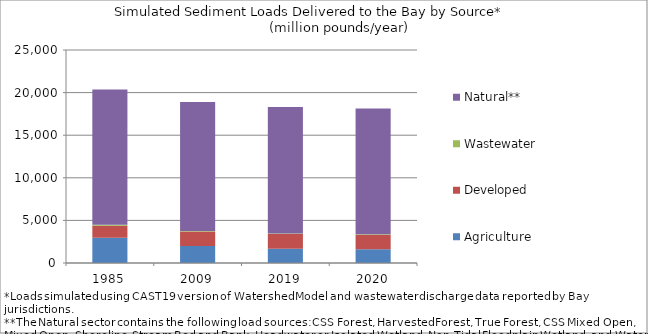
| Category | Agriculture | Developed | Wastewater | Natural** |
|---|---|---|---|---|
| 1985.0 | 2977.836 | 1382.732 | 125.811 | 15879.557 |
| 2009.0 | 2007.27 | 1683.184 | 60.487 | 15159.816 |
| 2019.0 | 1681.206 | 1724.709 | 47.653 | 14856.198 |
| 2020.0 | 1627.226 | 1700.264 | 43.368 | 14771.286 |